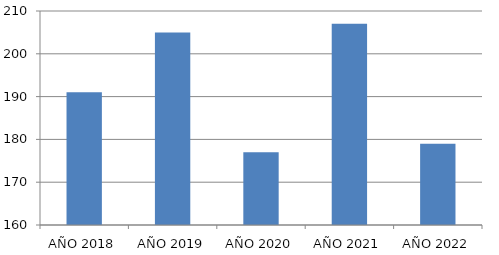
| Category | Series 0 |
|---|---|
| AÑO 2018 | 191 |
| AÑO 2019 | 205 |
| AÑO 2020 | 177 |
| AÑO 2021 | 207 |
| AÑO 2022 | 179 |